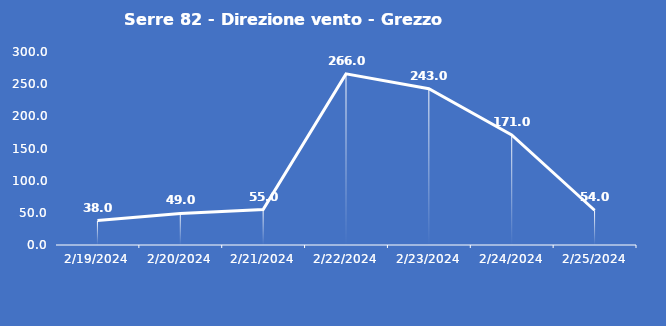
| Category | Serre 82 - Direzione vento - Grezzo (°N) |
|---|---|
| 2/19/24 | 38 |
| 2/20/24 | 49 |
| 2/21/24 | 55 |
| 2/22/24 | 266 |
| 2/23/24 | 243 |
| 2/24/24 | 171 |
| 2/25/24 | 54 |